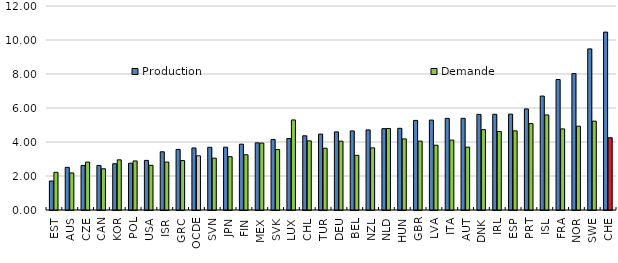
| Category | Production  | Demande |
|---|---|---|
| EST | 1.708 | 2.217 |
| AUS | 2.51 | 2.18 |
| CZE | 2.619 | 2.819 |
| CAN | 2.623 | 2.426 |
| KOR | 2.721 | 2.951 |
| POL | 2.752 | 2.885 |
| USA | 2.918 | 2.628 |
| ISR | 3.423 | 2.821 |
| GRC | 3.564 | 2.908 |
| OCDE | 3.649 | 3.189 |
| SVN | 3.689 | 3.05 |
| JPN | 3.692 | 3.137 |
| FIN | 3.873 | 3.249 |
| MEX | 3.95 | 3.936 |
| SVK | 4.149 | 3.553 |
| LUX | 4.207 | 5.297 |
| CHL | 4.365 | 4.068 |
| TUR | 4.465 | 3.633 |
| DEU | 4.595 | 4.049 |
| BEL | 4.651 | 3.216 |
| NZL | 4.712 | 3.654 |
| NLD | 4.786 | 4.795 |
| HUN | 4.804 | 4.184 |
| GBR | 5.27 | 4.052 |
| LVA | 5.289 | 3.811 |
| ITA | 5.39 | 4.112 |
| AUT | 5.394 | 3.697 |
| DNK | 5.627 | 4.726 |
| IRL | 5.63 | 4.62 |
| ESP | 5.637 | 4.655 |
| PRT | 5.945 | 5.08 |
| ISL | 6.702 | 5.593 |
| FRA | 7.674 | 4.771 |
| NOR | 8.023 | 4.927 |
| SWE | 9.477 | 5.228 |
| CHE | 10.463 | 4.251 |